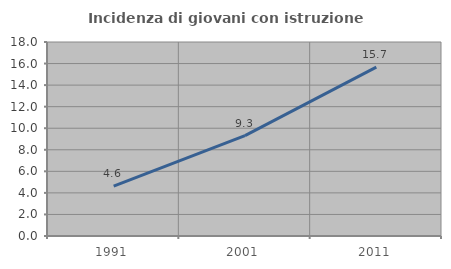
| Category | Incidenza di giovani con istruzione universitaria |
|---|---|
| 1991.0 | 4.637 |
| 2001.0 | 9.309 |
| 2011.0 | 15.664 |